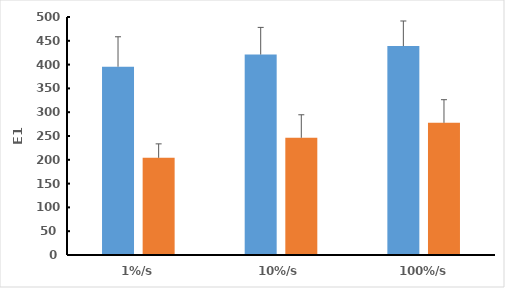
| Category | Native | Decellularised |
|---|---|---|
| 1%/s | 395.485 | 204.171 |
| 10%/s | 421.134 | 246.196 |
| 100%/s | 438.849 | 277.623 |